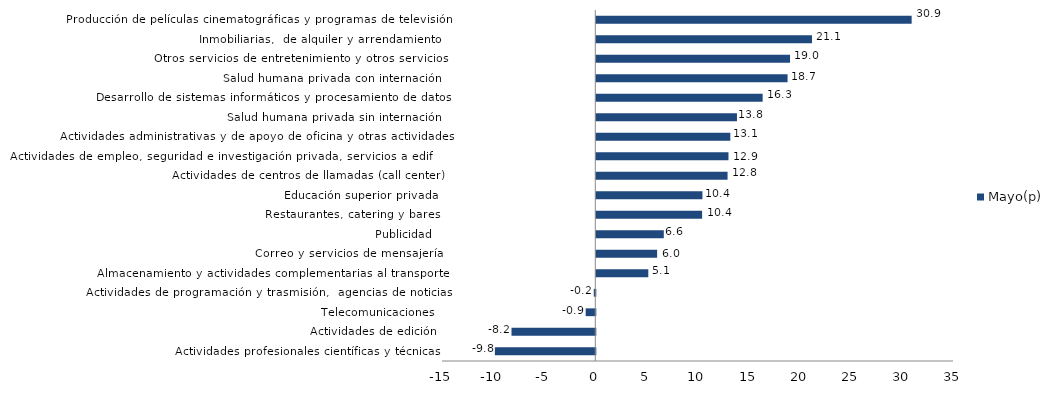
| Category | Mayo(p) |
|---|---|
| Actividades profesionales científicas y técnicas  | -9.827 |
| Actividades de edición | -8.2 |
| Telecomunicaciones | -0.943 |
| Actividades de programación y trasmisión,  agencias de noticias | -0.15 |
| Almacenamiento y actividades complementarias al transporte | 5.088 |
| Correo y servicios de mensajería | 5.951 |
| Publicidad | 6.605 |
| Restaurantes, catering y bares | 10.352 |
| Educación superior privada | 10.385 |
| Actividades de centros de llamadas (call center) | 12.843 |
| Actividades de empleo, seguridad e investigación privada, servicios a edificios | 12.933 |
| Actividades administrativas y de apoyo de oficina y otras actividades | 13.113 |
| Salud humana privada sin internación | 13.765 |
| Desarrollo de sistemas informáticos y procesamiento de datos | 16.277 |
| Salud humana privada con internación | 18.714 |
| Otros servicios de entretenimiento y otros servicios | 18.957 |
| Inmobiliarias,  de alquiler y arrendamiento  | 21.104 |
| Producción de películas cinematográficas y programas de televisión | 30.857 |